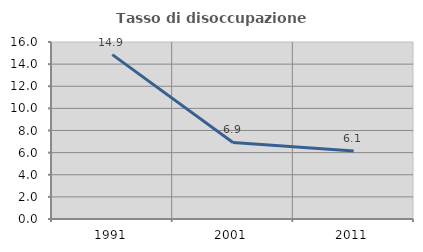
| Category | Tasso di disoccupazione giovanile  |
|---|---|
| 1991.0 | 14.857 |
| 2001.0 | 6.923 |
| 2011.0 | 6.14 |